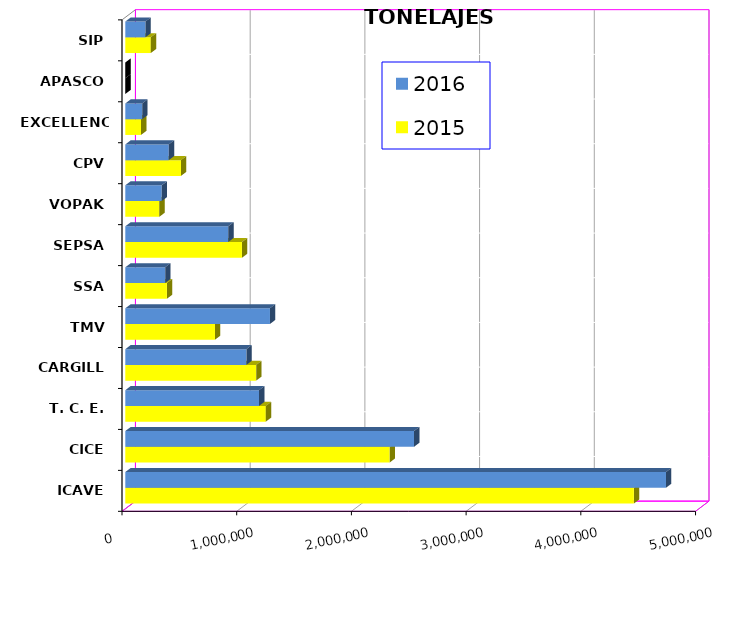
| Category | 2015 | 2016 |
|---|---|---|
| ICAVE | 4433718.502 | 4713604.79 |
| CICE | 2304335.918 | 2517041.222 |
| T. C. E. | 1225232.742 | 1166380.176 |
| CARGILL | 1140575.8 | 1055468.111 |
| TMV | 781766.533 | 1261092.105 |
| SSA | 362647.469 | 347611.485 |
| SEPSA | 1016630.83 | 897404.534 |
| VOPAK | 296131.799 | 317387.574 |
| CPV | 485295.47 | 378748.866 |
| EXCELLENCE | 137065.555 | 147466.63 |
| APASCO | 0 | 0 |
| SIP | 222189.34 | 175773.12 |